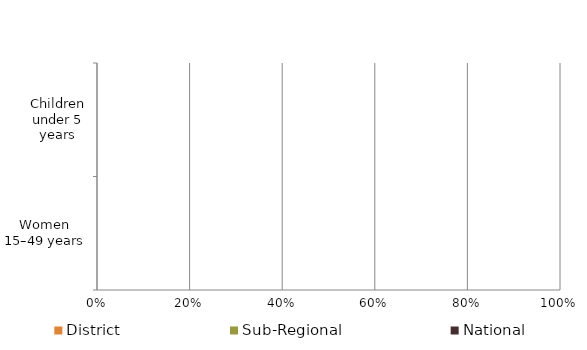
| Category | National | Sub-Regional | District |
|---|---|---|---|
| Women 15–49 years | 0 | 0 | 0 |
| Children under 5 years | 0 | 0 | 0 |